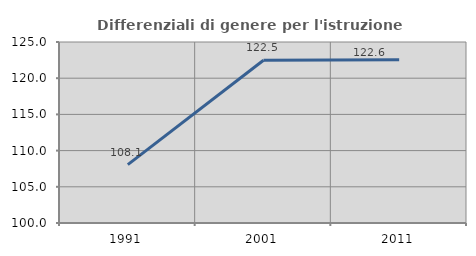
| Category | Differenziali di genere per l'istruzione superiore |
|---|---|
| 1991.0 | 108.055 |
| 2001.0 | 122.479 |
| 2011.0 | 122.56 |